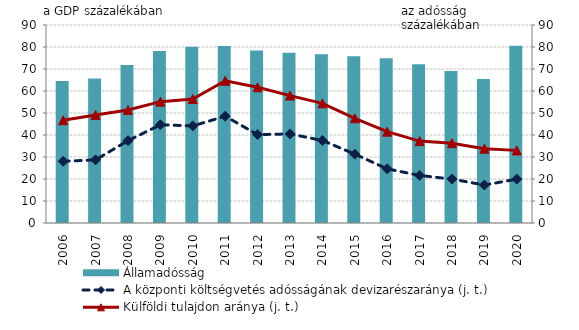
| Category | Államadósság |
|---|---|
| 2006.0 | 64.504 |
| 2007.0 | 65.654 |
| 2008.0 | 71.843 |
| 2009.0 | 78.217 |
| 2010.0 | 80.163 |
| 2011.0 | 80.442 |
| 2012.0 | 78.361 |
| 2013.0 | 77.354 |
| 2014.0 | 76.688 |
| 2015.0 | 75.821 |
| 2016.0 | 74.932 |
| 2017.0 | 72.163 |
| 2018.0 | 69.123 |
| 2019.0 | 65.479 |
| 2020.0 | 80.597 |